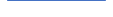
| Category | Series 0 |
|---|---|
| 0 | 28 |
| 1 | 35 |
| 2 | 18 |
| 3 | 22 |
| 4 | 15 |
| 5 | 20 |
| 6 | 31 |
| 7 | 34 |
| 8 | 44 |